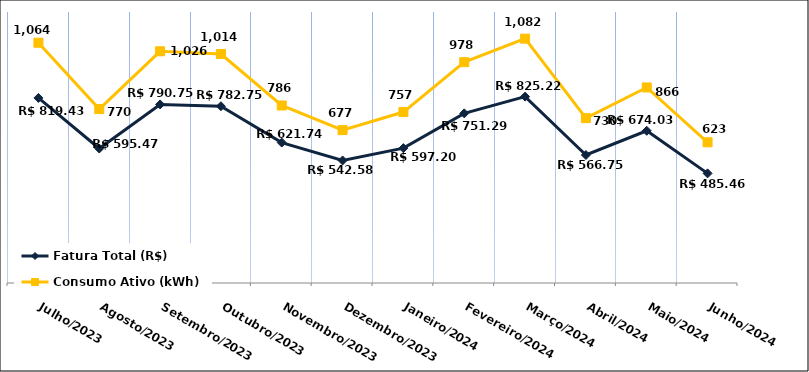
| Category | Fatura Total (R$) |
|---|---|
| Julho/2023 | 819.43 |
| Agosto/2023 | 595.47 |
| Setembro/2023 | 790.75 |
| Outubro/2023 | 782.75 |
| Novembro/2023 | 621.74 |
| Dezembro/2023 | 542.58 |
| Janeiro/2024 | 597.2 |
| Fevereiro/2024 | 751.29 |
| Março/2024 | 825.22 |
| Abril/2024 | 566.75 |
| Maio/2024 | 674.03 |
| Junho/2024 | 485.46 |